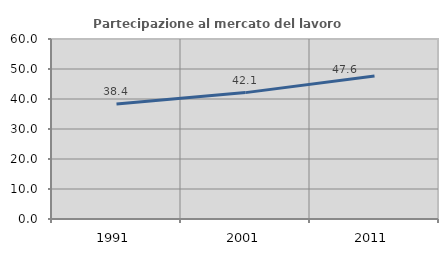
| Category | Partecipazione al mercato del lavoro  femminile |
|---|---|
| 1991.0 | 38.358 |
| 2001.0 | 42.129 |
| 2011.0 | 47.646 |